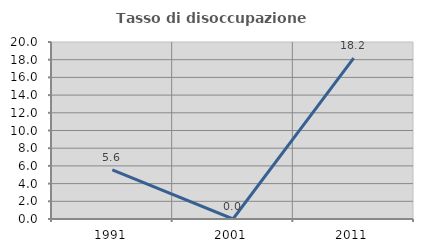
| Category | Tasso di disoccupazione giovanile  |
|---|---|
| 1991.0 | 5.556 |
| 2001.0 | 0 |
| 2011.0 | 18.182 |